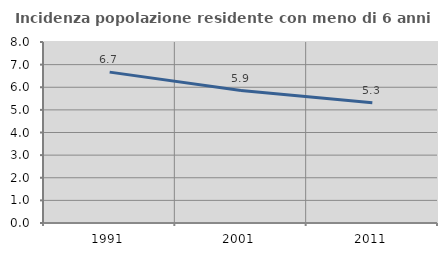
| Category | Incidenza popolazione residente con meno di 6 anni |
|---|---|
| 1991.0 | 6.669 |
| 2001.0 | 5.854 |
| 2011.0 | 5.315 |